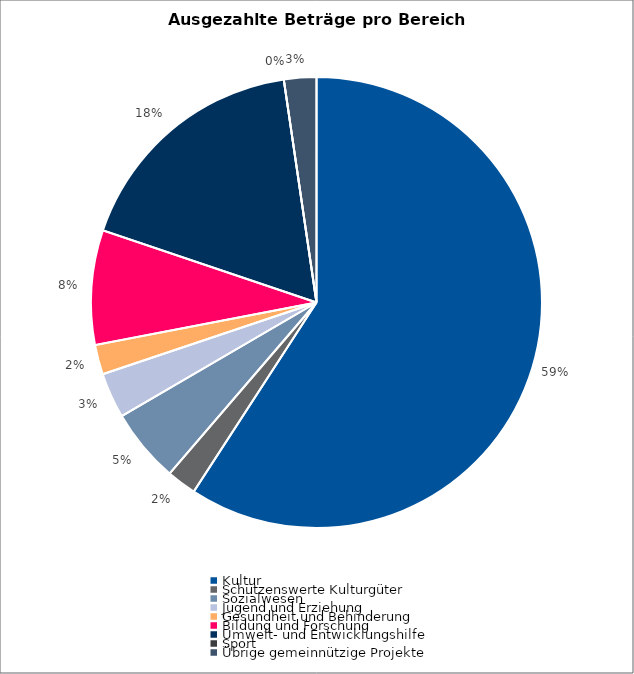
| Category | Series 0 |
|---|---|
| Kultur | 6829667.24 |
| Schützenswerte Kulturgüter | 246655 |
| Sozialwesen | 612031 |
| Jugend und Erziehung | 375200 |
| Gesundheit und Behinderung | 245337 |
| Bildung und Forschung | 947901 |
| Umwelt- und Entwicklungshilfe | 2019500 |
| Sport | 0 |
| Übrige gemeinnützige Projekte | 268000 |